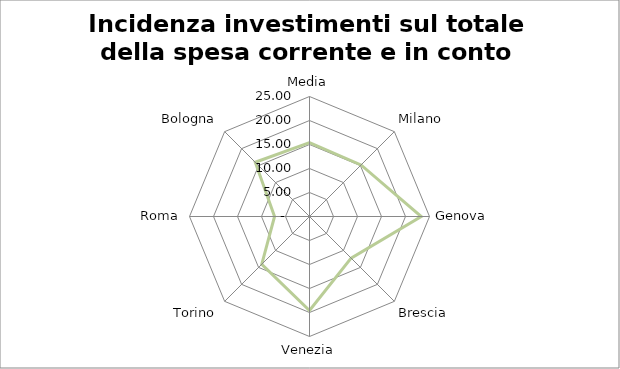
| Category | Incidenza investimenti sul totale della spesa corrente e in conto capitale |
|---|---|
| Media | 15.376 |
| Milano | 15.18 |
| Genova | 23.28 |
| Brescia | 12.26 |
| Venezia | 19.59 |
| Torino | 14.06 |
| Roma | 7.28 |
| Bologna | 15.98 |